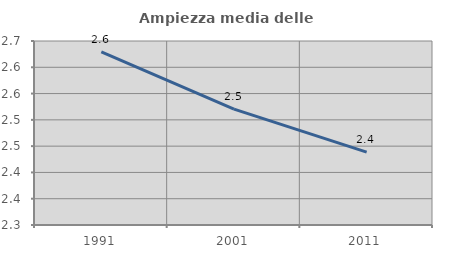
| Category | Ampiezza media delle famiglie |
|---|---|
| 1991.0 | 2.629 |
| 2001.0 | 2.52 |
| 2011.0 | 2.439 |